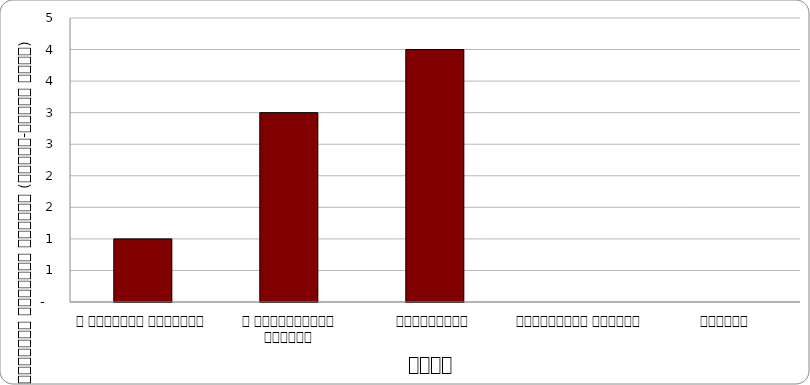
| Category | अन्य |
|---|---|
| द हिमालयन टाइम्स् | 1 |
| द काठमाण्डौं पोस्ट् | 3 |
| कान्तिपुर | 4 |
| अन्नपूर्ण पोस्ट् | 0 |
| नागरिक | 0 |